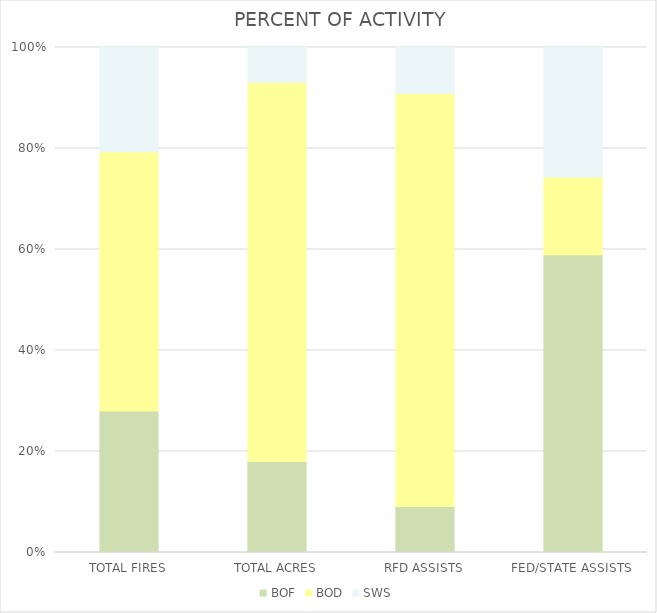
| Category | BOF | BOD | SWS |
|---|---|---|---|
| TOTAL FIRES | 42 | 77 | 31 |
| TOTAL ACRES | 3346.16 | 13963.25 | 1282.55 |
| RFD ASSISTS | 1 | 9 | 1 |
| FED/STATE ASSISTS | 23 | 6 | 10 |